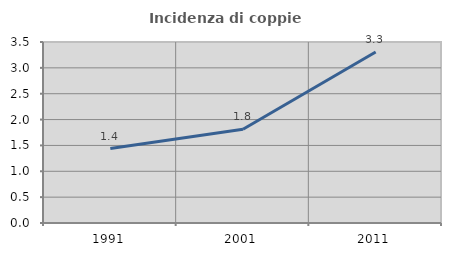
| Category | Incidenza di coppie miste |
|---|---|
| 1991.0 | 1.439 |
| 2001.0 | 1.813 |
| 2011.0 | 3.306 |